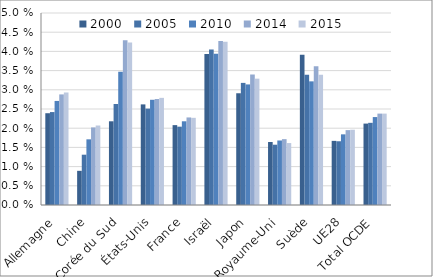
| Category | 2000 | 2005 | 2010 | 2014 | 2015 |
|---|---|---|---|---|---|
| Allemagne | 2.39 | 2.42 | 2.71 | 2.88 | 2.93 |
| Chine | 0.89 | 1.31 | 1.71 | 2.02 | 2.07 |
| Corée du Sud | 2.18 | 2.63 | 3.47 | 4.29 | 4.23 |
| États-Unis | 2.62 | 2.51 | 2.74 | 2.76 | 2.79 |
| France | 2.08 | 2.04 | 2.18 | 2.28 | 2.27 |
| Israël | 3.93 | 4.05 | 3.94 | 4.27 | 4.25 |
| Japon | 2.91 | 3.18 | 3.14 | 3.4 | 3.29 |
| Royaume-Uni | 1.64 | 1.57 | 1.68 | 1.715 | 1.613 |
| Suède | 3.91 | 3.39 | 3.22 | 3.614 | 3.391 |
| UE28 | 1.67 | 1.66 | 1.84 | 1.95 | 1.96 |
| Total OCDE | 2.12 | 2.14 | 2.29 | 2.38 | 2.38 |